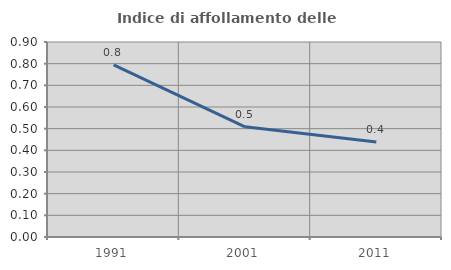
| Category | Indice di affollamento delle abitazioni  |
|---|---|
| 1991.0 | 0.795 |
| 2001.0 | 0.509 |
| 2011.0 | 0.438 |